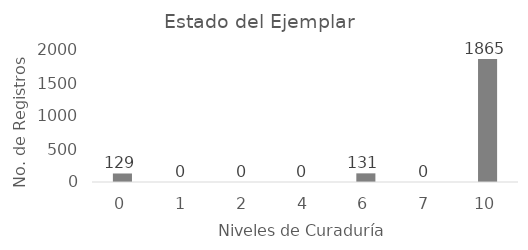
| Category | # de registros |
|---|---|
| 0.0 | 129 |
| 1.0 | 0 |
| 2.0 | 0 |
| 4.0 | 0 |
| 6.0 | 131 |
| 7.0 | 0 |
| 10.0 | 1865 |